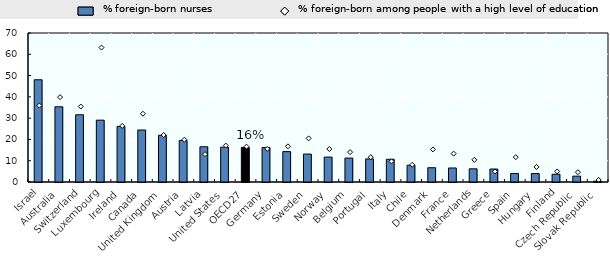
| Category | % foreign-born nurses |
|---|---|
| Israel | 48.027 |
| Australia | 35.334 |
| Switzerland | 31.59 |
| Luxembourg | 29.051 |
| Ireland | 26.079 |
| Canada | 24.429 |
| United Kingdom | 21.939 |
| Austria | 19.552 |
| Latvia | 16.559 |
| United States | 16.356 |
| OECD27 | 16.242 |
| Germany | 16.195 |
| Estonia | 14.276 |
| Sweden | 13.124 |
| Norway | 11.707 |
| Belgium | 11.245 |
| Portugal | 10.849 |
| Italy | 10.681 |
| Chile | 7.871 |
| Denmark | 6.708 |
| France | 6.586 |
| Netherlands | 6.19 |
| Greece | 6.094 |
| Spain | 3.982 |
| Hungary | 3.965 |
| Finland | 3.633 |
| Czech Republic | 2.74 |
| Slovak Republic | 0.38 |